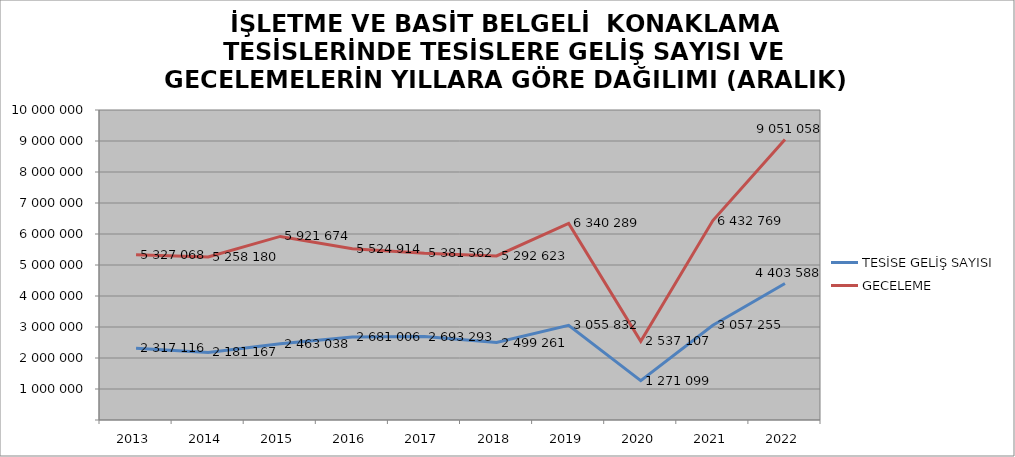
| Category | TESİSE GELİŞ SAYISI | GECELEME |
|---|---|---|
| 2013 | 2317116 | 5327068 |
| 2014 | 2181167 | 5258180 |
| 2015 | 2463038 | 5921674 |
| 2016 | 2681006 | 5524914 |
| 2017 | 2693293 | 5381562 |
| 2018 | 2499261 | 5292623 |
| 2019 | 3055832 | 6340289 |
| 2020 | 1271099 | 2537107 |
| 2021 | 3057255 | 6432769 |
| 2022 | 4403588 | 9051058 |